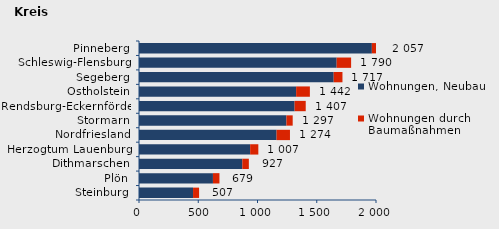
| Category | Wohnungen, Neubau | Wohnungen durch Baumaßnahmen | Series 2 |
|---|---|---|---|
| Steinburg | 456 | 51 | 507 |
| Plön | 624 | 55 | 679 |
| Dithmarschen | 872 | 55 | 927 |
| Herzogtum Lauenburg | 938 | 69 | 1007 |
| Nordfriesland | 1161 | 113 | 1274 |
| Stormarn | 1244 | 53 | 1297 |
| Rendsburg-Eckernförde | 1313 | 94 | 1407 |
| Ostholstein | 1326 | 116 | 1442 |
| Segeberg | 1643 | 74 | 1717 |
| Schleswig-Flensburg | 1668 | 122 | 1790 |
| Pinneberg | 1965 | 92 | 2057 |